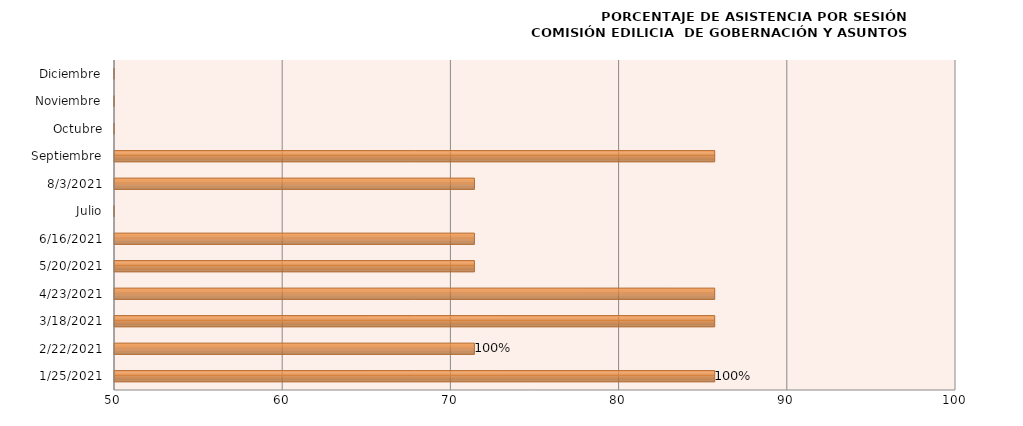
| Category | Series 0 |
|---|---|
| 25/01/2021 | 85.714 |
| 22/02/2021 | 71.429 |
| 18/03/2021 | 85.714 |
| 23/04/2021 | 85.714 |
| 20/05/2021 | 71.429 |
| 16/06/2021 | 71.429 |
| Julio | 0 |
| 03/08/2021 | 71.429 |
| Septiembre | 85.714 |
| Octubre | 0 |
| Noviembre | 0 |
| Diciembre | 0 |